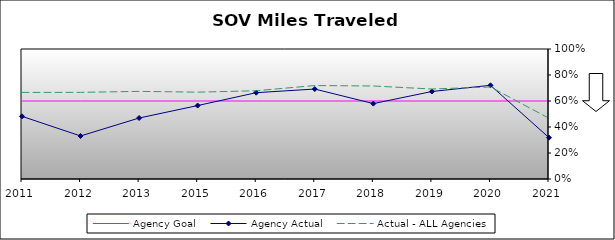
| Category | Agency Goal | Agency Actual | Actual - ALL Agencies |
|---|---|---|---|
| 2011.0 | 0.6 | 0.482 | 0.666 |
| 2012.0 | 0.6 | 0.331 | 0.666 |
| 2013.0 | 0.6 | 0.469 | 0.674 |
| 2015.0 | 0.6 | 0.565 | 0.668 |
| 2016.0 | 0.6 | 0.664 | 0.679 |
| 2017.0 | 0.6 | 0.692 | 0.719 |
| 2018.0 | 0.6 | 0.58 | 0.715 |
| 2019.0 | 0.6 | 0.673 | 0.692 |
| 2020.0 | 0.6 | 0.721 | 0.708 |
| 2021.0 | 0.6 | 0.318 | 0.467 |